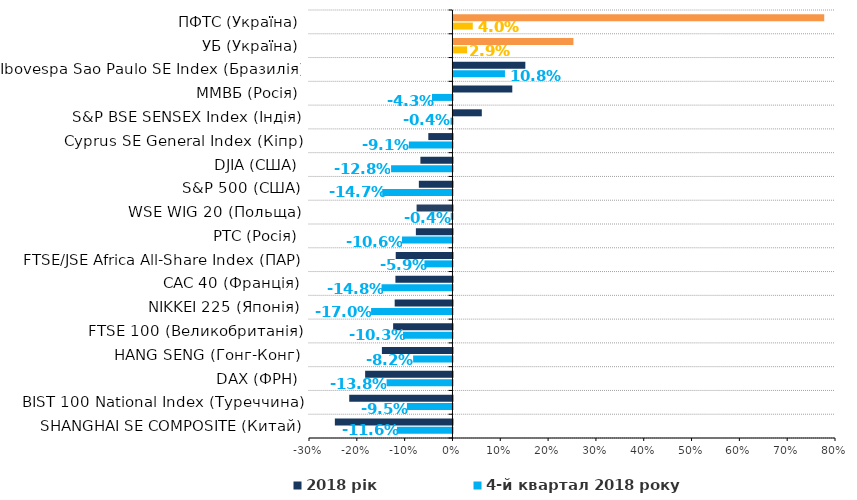
| Category | 4-й квартал 2018 року | 2018 рік |
|---|---|---|
| SHANGHAI SE COMPOSITE (Китай) | -0.116 | -0.246 |
| BIST 100 National Index (Туреччина) | -0.095 | -0.216 |
| DAX (ФРН) | -0.138 | -0.183 |
| HANG SENG (Гонг-Конг) | -0.082 | -0.148 |
| FTSE 100 (Великобританія) | -0.103 | -0.124 |
| NIKKEI 225 (Японія) | -0.17 | -0.121 |
| CAC 40 (Франція) | -0.148 | -0.119 |
| FTSE/JSE Africa All-Share Index (ПАР) | -0.059 | -0.119 |
| РТС (Росія) | -0.106 | -0.076 |
| WSE WIG 20 (Польща) | -0.004 | -0.075 |
| S&P 500 (США) | -0.147 | -0.07 |
| DJIA (США) | -0.128 | -0.067 |
| Cyprus SE General Index (Кіпр) | -0.091 | -0.051 |
| S&P BSE SENSEX Index (Індія) | -0.004 | 0.059 |
| ММВБ (Росія) | -0.043 | 0.123 |
| Ibovespa Sao Paulo SE Index (Бразилія) | 0.108 | 0.15 |
| УБ (Україна) | 0.029 | 0.251 |
| ПФТС (Україна) | 0.04 | 0.775 |